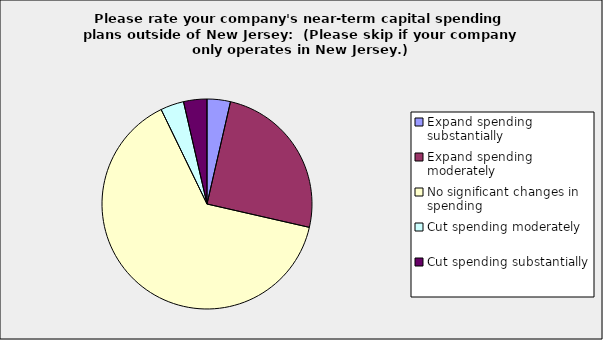
| Category | Series 0 |
|---|---|
| Expand spending substantially | 0.036 |
| Expand spending moderately | 0.25 |
| No significant changes in spending | 0.643 |
| Cut spending moderately | 0.036 |
| Cut spending substantially | 0.036 |